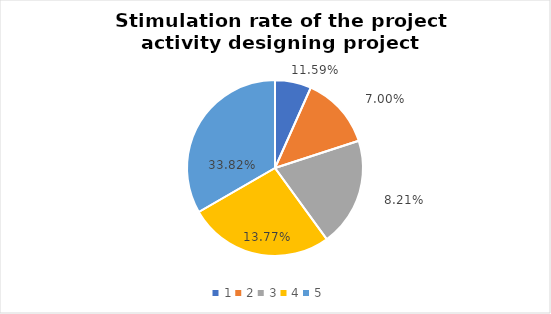
| Category | Series 0 | Series 1 |
|---|---|---|
| 0 | 1 | 0.116 |
| 1 | 2 | 0.07 |
| 2 | 3 | 0.082 |
| 3 | 4 | 0.138 |
| 4 | 5 | 0.338 |